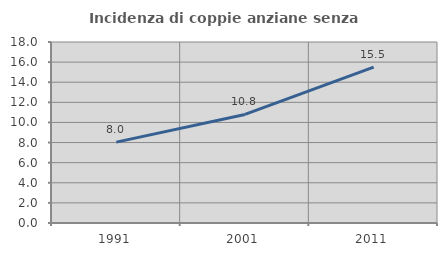
| Category | Incidenza di coppie anziane senza figli  |
|---|---|
| 1991.0 | 8.045 |
| 2001.0 | 10.794 |
| 2011.0 | 15.51 |